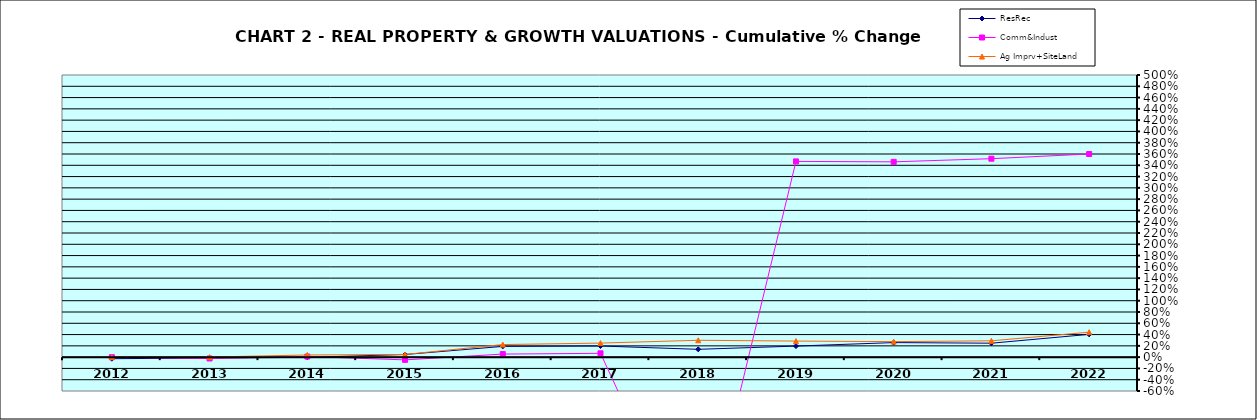
| Category | ResRec | Comm&Indust | Ag Imprv+SiteLand |
|---|---|---|---|
| 2012.0 | -0.027 | 0 | 0 |
| 2013.0 | -0.015 | -0.024 | 0.001 |
| 2014.0 | -0.004 | 0.011 | 0.038 |
| 2015.0 | 0.047 | -0.048 | 0.048 |
| 2016.0 | 0.19 | 0.054 | 0.223 |
| 2017.0 | 0.197 | 0.068 | 0.249 |
| 2018.0 | 0.139 | -3.674 | 0.299 |
| 2019.0 | 0.196 | 3.469 | 0.285 |
| 2020.0 | 0.258 | 3.461 | 0.275 |
| 2021.0 | 0.247 | 3.517 | 0.289 |
| 2022.0 | 0.403 | 3.6 | 0.443 |